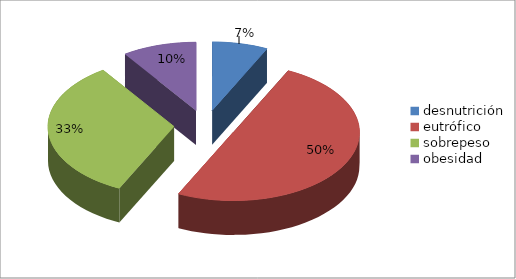
| Category | Series 0 |
|---|---|
| desnutrición | 0.071 |
| eutrófico | 0.5 |
| sobrepeso | 0.333 |
| obesidad | 0.095 |